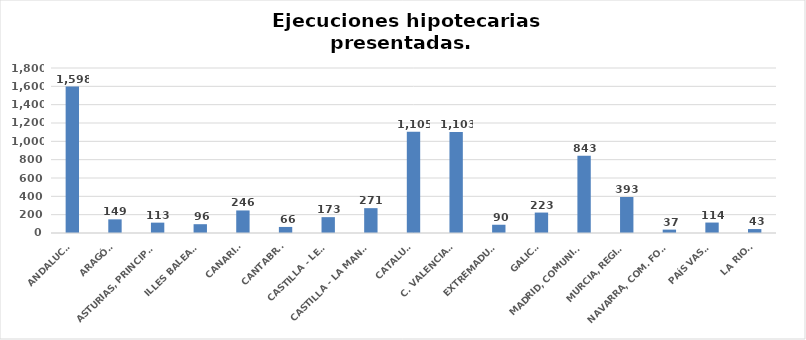
| Category | Series 0 |
|---|---|
| ANDALUCÍA | 1598 |
| ARAGÓN | 149 |
| ASTURIAS, PRINCIPADO | 113 |
| ILLES BALEARS | 96 |
| CANARIAS | 246 |
| CANTABRIA | 66 |
| CASTILLA - LEÓN | 173 |
| CASTILLA - LA MANCHA | 271 |
| CATALUÑA | 1105 |
| C. VALENCIANA | 1103 |
| EXTREMADURA | 90 |
| GALICIA | 223 |
| MADRID, COMUNIDAD | 843 |
| MURCIA, REGIÓN | 393 |
| NAVARRA, COM. FORAL | 37 |
| PAÍS VASCO | 114 |
| LA RIOJA | 43 |